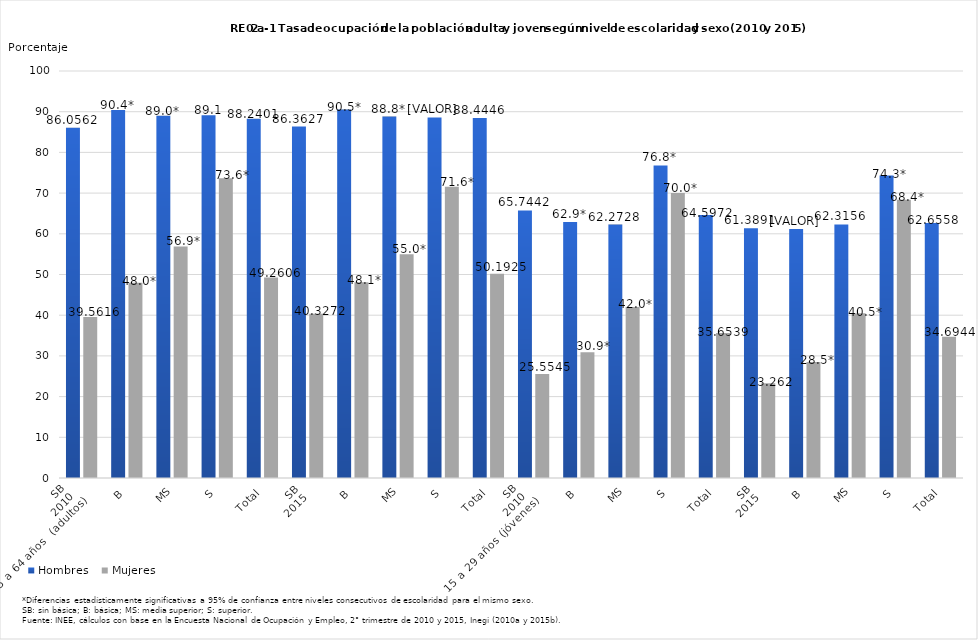
| Category | Hombres | Mujeres |
|---|---|---|
| 0 | 86.056 | 39.562 |
| 1 | 90.447 | 47.985 |
| 2 | 89.01 | 56.89 |
| 3 | 89.11 | 73.642 |
| 4 | 88.24 | 49.261 |
| 5 | 86.363 | 40.327 |
| 6 | 90.526 | 48.102 |
| 7 | 88.794 | 54.966 |
| 8 | 88.596 | 71.567 |
| 9 | 88.445 | 50.192 |
| 10 | 65.744 | 25.554 |
| 11 | 62.912 | 30.909 |
| 12 | 62.273 | 42.005 |
| 13 | 76.802 | 70.03 |
| 14 | 64.597 | 35.654 |
| 15 | 61.389 | 23.262 |
| 16 | 61.171 | 28.491 |
| 17 | 62.316 | 40.452 |
| 18 | 74.324 | 68.378 |
| 19 | 62.656 | 34.694 |